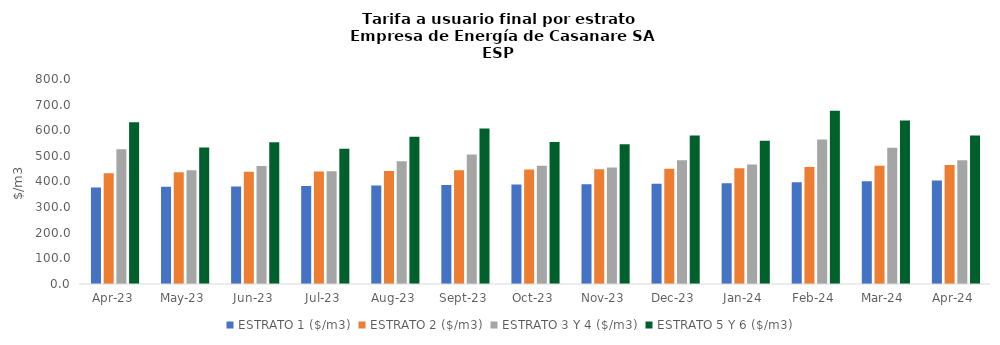
| Category | ESTRATO 1 ($/m3) | ESTRATO 2 ($/m3) | ESTRATO 3 Y 4 ($/m3) | ESTRATO 5 Y 6 ($/m3) |
|---|---|---|---|---|
| 2023-04-01 | 376.32 | 432.49 | 525.703 | 630.843 |
| 2023-05-01 | 379.26 | 435.87 | 444.034 | 532.841 |
| 2023-06-01 | 380.92 | 437.78 | 460.92 | 553.104 |
| 2023-07-01 | 382.06 | 439.09 | 440.108 | 528.13 |
| 2023-08-01 | 383.97 | 441.29 | 479.093 | 574.912 |
| 2023-09-01 | 386.66 | 444.37 | 505.302 | 606.362 |
| 2023-10-01 | 388.72 | 446.74 | 461.695 | 554.034 |
| 2023-11-01 | 389.69 | 447.85 | 454.34 | 545.208 |
| 2023-12-01 | 391.51 | 449.95 | 483.31 | 579.972 |
| 2024-01-01 | 393.31 | 452.02 | 465.872 | 559.047 |
| 2024-02-01 | 396.91 | 456.16 | 563.437 | 676.124 |
| 2024-03-01 | 401.22 | 461.11 | 531.944 | 638.333 |
| 2024-04-01 | 404.05 | 464.36 | 483.205 | 579.846 |